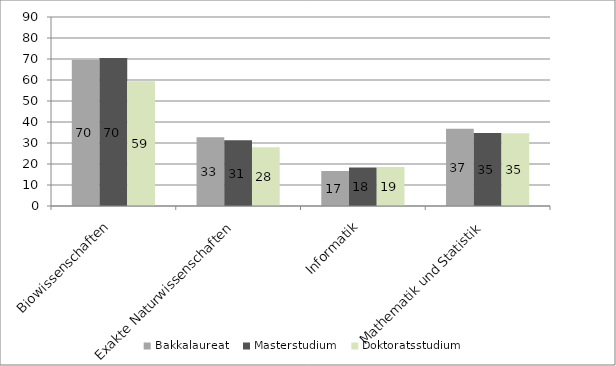
| Category | Bakkalaureat  | Masterstudium  | Doktoratsstudium  |
|---|---|---|---|
| Biowissenschaften | 69.668 | 70.417 | 59.459 |
| Exakte Naturwissenschaften | 32.764 | 31.28 | 27.928 |
| Informatik | 16.645 | 18.293 | 18.557 |
| Mathematik und Statistik | 36.842 | 34.756 | 34.667 |